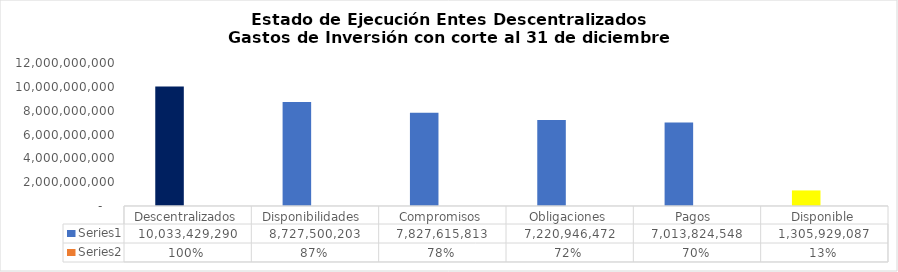
| Category | Series 0 | Series 1 |
|---|---|---|
| Descentralizados | 10033429290.13 | 1 |
| Disponibilidades  | 8727500202.95 | 0.87 |
| Compromisos | 7827615812.56 | 0.78 |
| Obligaciones | 7220946472.14 | 0.72 |
| Pagos  | 7013824548.21 | 0.699 |
| Disponible | 1305929087.18 | 0.13 |